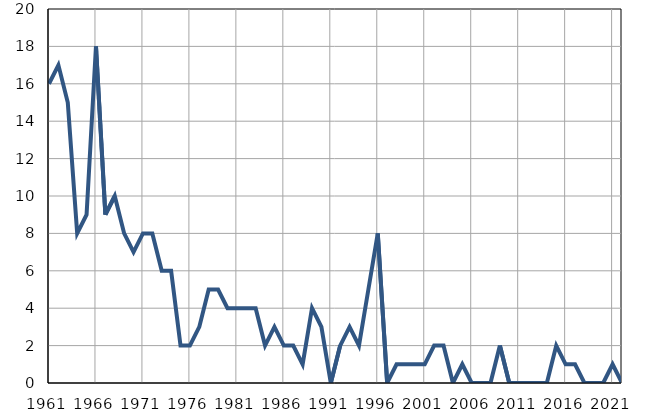
| Category | Умрла 
одојчад |
|---|---|
| 1961.0 | 16 |
| 1962.0 | 17 |
| 1963.0 | 15 |
| 1964.0 | 8 |
| 1965.0 | 9 |
| 1966.0 | 18 |
| 1967.0 | 9 |
| 1968.0 | 10 |
| 1969.0 | 8 |
| 1970.0 | 7 |
| 1971.0 | 8 |
| 1972.0 | 8 |
| 1973.0 | 6 |
| 1974.0 | 6 |
| 1975.0 | 2 |
| 1976.0 | 2 |
| 1977.0 | 3 |
| 1978.0 | 5 |
| 1979.0 | 5 |
| 1980.0 | 4 |
| 1981.0 | 4 |
| 1982.0 | 4 |
| 1983.0 | 4 |
| 1984.0 | 2 |
| 1985.0 | 3 |
| 1986.0 | 2 |
| 1987.0 | 2 |
| 1988.0 | 1 |
| 1989.0 | 4 |
| 1990.0 | 3 |
| 1991.0 | 0 |
| 1992.0 | 2 |
| 1993.0 | 3 |
| 1994.0 | 2 |
| 1995.0 | 5 |
| 1996.0 | 8 |
| 1997.0 | 0 |
| 1998.0 | 1 |
| 1999.0 | 1 |
| 2000.0 | 1 |
| 2001.0 | 1 |
| 2002.0 | 2 |
| 2003.0 | 2 |
| 2004.0 | 0 |
| 2005.0 | 1 |
| 2006.0 | 0 |
| 2007.0 | 0 |
| 2008.0 | 0 |
| 2009.0 | 2 |
| 2010.0 | 0 |
| 2011.0 | 0 |
| 2012.0 | 0 |
| 2013.0 | 0 |
| 2014.0 | 0 |
| 2015.0 | 2 |
| 2016.0 | 1 |
| 2017.0 | 1 |
| 2018.0 | 0 |
| 2019.0 | 0 |
| 2020.0 | 0 |
| 2021.0 | 1 |
| 2022.0 | 0 |